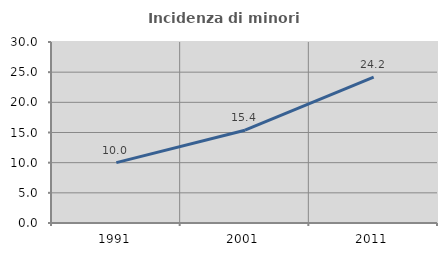
| Category | Incidenza di minori stranieri |
|---|---|
| 1991.0 | 10 |
| 2001.0 | 15.385 |
| 2011.0 | 24.167 |